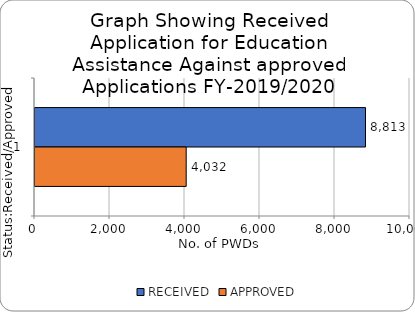
| Category | RECEIVED  | APPROVED |
|---|---|---|
| 0 | 8813 | 4032 |